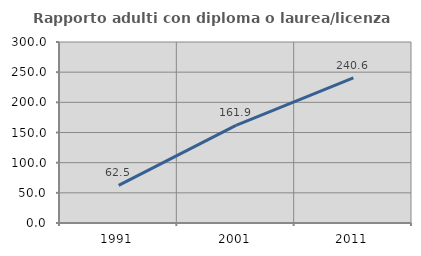
| Category | Rapporto adulti con diploma o laurea/licenza media  |
|---|---|
| 1991.0 | 62.5 |
| 2001.0 | 161.905 |
| 2011.0 | 240.625 |